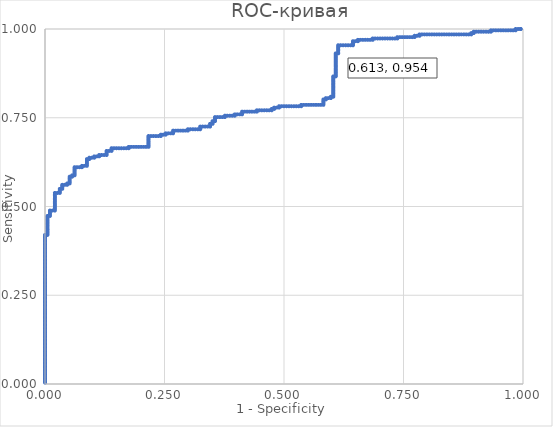
| Category | roc-кривая |
|---|---|
| 0.0 | 0.004 |
| 0.0 | 0.008 |
| 0.0 | 0.011 |
| 0.0 | 0.015 |
| 0.0 | 0.019 |
| 0.0 | 0.023 |
| 0.0 | 0.027 |
| 0.0 | 0.031 |
| 0.0 | 0.034 |
| 0.0 | 0.038 |
| 0.0 | 0.042 |
| 0.0 | 0.046 |
| 0.0 | 0.05 |
| 0.0 | 0.053 |
| 0.0 | 0.057 |
| 0.0 | 0.061 |
| 0.0 | 0.065 |
| 0.0 | 0.069 |
| 0.0 | 0.073 |
| 0.0 | 0.076 |
| 0.0 | 0.08 |
| 0.0 | 0.084 |
| 0.0 | 0.088 |
| 0.0 | 0.092 |
| 0.0 | 0.095 |
| 0.0 | 0.099 |
| 0.0 | 0.103 |
| 0.0 | 0.107 |
| 0.0 | 0.111 |
| 0.0 | 0.115 |
| 0.0 | 0.118 |
| 0.0 | 0.122 |
| 0.0 | 0.126 |
| 0.0 | 0.13 |
| 0.0 | 0.134 |
| 0.0 | 0.137 |
| 0.0 | 0.141 |
| 0.0 | 0.145 |
| 0.0 | 0.149 |
| 0.0 | 0.153 |
| 0.0 | 0.156 |
| 0.0 | 0.16 |
| 0.0 | 0.164 |
| 0.0 | 0.168 |
| 0.0 | 0.172 |
| 0.0 | 0.176 |
| 0.0 | 0.179 |
| 0.0 | 0.183 |
| 0.0 | 0.187 |
| 0.0 | 0.191 |
| 0.0 | 0.195 |
| 0.0 | 0.198 |
| 0.0 | 0.202 |
| 0.0 | 0.206 |
| 0.0 | 0.21 |
| 0.0 | 0.214 |
| 0.0 | 0.218 |
| 0.0 | 0.221 |
| 0.0 | 0.225 |
| 0.0 | 0.229 |
| 0.0 | 0.233 |
| 0.0 | 0.237 |
| 0.0 | 0.24 |
| 0.0 | 0.244 |
| 0.0 | 0.248 |
| 0.0 | 0.252 |
| 0.0 | 0.256 |
| 0.0 | 0.26 |
| 0.0 | 0.263 |
| 0.0 | 0.267 |
| 0.0 | 0.271 |
| 0.0 | 0.275 |
| 0.0 | 0.279 |
| 0.0 | 0.282 |
| 0.0 | 0.286 |
| 0.0 | 0.29 |
| 0.0 | 0.294 |
| 0.0 | 0.298 |
| 0.0 | 0.302 |
| 0.0 | 0.305 |
| 0.0 | 0.309 |
| 0.0 | 0.313 |
| 0.0 | 0.317 |
| 0.0 | 0.321 |
| 0.0 | 0.324 |
| 0.0 | 0.328 |
| 0.0 | 0.332 |
| 0.0 | 0.336 |
| 0.0 | 0.34 |
| 0.0 | 0.344 |
| 0.0 | 0.347 |
| 0.0 | 0.351 |
| 0.0 | 0.355 |
| 0.0 | 0.359 |
| 0.0 | 0.363 |
| 0.0 | 0.366 |
| 0.0 | 0.37 |
| 0.0 | 0.374 |
| 0.0 | 0.378 |
| 0.0 | 0.382 |
| 0.0 | 0.385 |
| 0.0 | 0.389 |
| 0.0 | 0.393 |
| 0.0 | 0.397 |
| 0.0 | 0.401 |
| 0.0 | 0.405 |
| 0.0 | 0.408 |
| 0.0 | 0.412 |
| 0.0 | 0.416 |
| 0.0 | 0.42 |
| 0.005154639175257714 | 0.42 |
| 0.005154639175257714 | 0.424 |
| 0.005154639175257714 | 0.427 |
| 0.005154639175257714 | 0.431 |
| 0.005154639175257714 | 0.435 |
| 0.005154639175257714 | 0.439 |
| 0.005154639175257714 | 0.443 |
| 0.005154639175257714 | 0.447 |
| 0.005154639175257714 | 0.45 |
| 0.005154639175257714 | 0.454 |
| 0.005154639175257714 | 0.458 |
| 0.005154639175257714 | 0.462 |
| 0.005154639175257714 | 0.466 |
| 0.005154639175257714 | 0.469 |
| 0.005154639175257714 | 0.473 |
| 0.010309278350515427 | 0.473 |
| 0.010309278350515427 | 0.477 |
| 0.010309278350515427 | 0.481 |
| 0.010309278350515427 | 0.485 |
| 0.010309278350515427 | 0.489 |
| 0.015463917525773141 | 0.489 |
| 0.020618556701030966 | 0.489 |
| 0.020618556701030966 | 0.492 |
| 0.020618556701030966 | 0.496 |
| 0.020618556701030966 | 0.5 |
| 0.020618556701030966 | 0.504 |
| 0.020618556701030966 | 0.508 |
| 0.020618556701030966 | 0.511 |
| 0.020618556701030966 | 0.515 |
| 0.020618556701030966 | 0.519 |
| 0.020618556701030966 | 0.523 |
| 0.020618556701030966 | 0.527 |
| 0.020618556701030966 | 0.531 |
| 0.020618556701030966 | 0.534 |
| 0.020618556701030966 | 0.538 |
| 0.02577319587628868 | 0.538 |
| 0.030927835051546393 | 0.538 |
| 0.030927835051546393 | 0.542 |
| 0.030927835051546393 | 0.546 |
| 0.030927835051546393 | 0.55 |
| 0.03608247422680411 | 0.55 |
| 0.03608247422680411 | 0.553 |
| 0.03608247422680411 | 0.557 |
| 0.03608247422680411 | 0.561 |
| 0.04123711340206182 | 0.561 |
| 0.046391752577319534 | 0.561 |
| 0.046391752577319534 | 0.565 |
| 0.05154639175257736 | 0.565 |
| 0.05154639175257736 | 0.569 |
| 0.05154639175257736 | 0.573 |
| 0.05154639175257736 | 0.576 |
| 0.05154639175257736 | 0.58 |
| 0.05154639175257736 | 0.584 |
| 0.05670103092783507 | 0.584 |
| 0.05670103092783507 | 0.588 |
| 0.061855670103092786 | 0.588 |
| 0.061855670103092786 | 0.592 |
| 0.061855670103092786 | 0.595 |
| 0.061855670103092786 | 0.599 |
| 0.061855670103092786 | 0.603 |
| 0.061855670103092786 | 0.607 |
| 0.061855670103092786 | 0.611 |
| 0.0670103092783505 | 0.611 |
| 0.07216494845360821 | 0.611 |
| 0.07731958762886593 | 0.611 |
| 0.07731958762886593 | 0.615 |
| 0.08247422680412375 | 0.615 |
| 0.08762886597938147 | 0.615 |
| 0.08762886597938147 | 0.618 |
| 0.08762886597938147 | 0.622 |
| 0.08762886597938147 | 0.626 |
| 0.08762886597938147 | 0.63 |
| 0.08762886597938147 | 0.634 |
| 0.09278350515463918 | 0.634 |
| 0.09278350515463918 | 0.637 |
| 0.09793814432989689 | 0.637 |
| 0.1030927835051546 | 0.637 |
| 0.1030927835051546 | 0.641 |
| 0.10824742268041232 | 0.641 |
| 0.11340206185567014 | 0.641 |
| 0.11340206185567014 | 0.645 |
| 0.11855670103092786 | 0.645 |
| 0.12371134020618557 | 0.645 |
| 0.12886597938144329 | 0.645 |
| 0.12886597938144329 | 0.649 |
| 0.12886597938144329 | 0.653 |
| 0.12886597938144329 | 0.656 |
| 0.134020618556701 | 0.656 |
| 0.1391752577319587 | 0.656 |
| 0.1391752577319587 | 0.66 |
| 0.1391752577319587 | 0.664 |
| 0.14432989690721654 | 0.664 |
| 0.14948453608247425 | 0.664 |
| 0.15463917525773196 | 0.664 |
| 0.15979381443298968 | 0.664 |
| 0.1649484536082474 | 0.664 |
| 0.1701030927835051 | 0.664 |
| 0.17525773195876293 | 0.664 |
| 0.17525773195876293 | 0.668 |
| 0.18041237113402064 | 0.668 |
| 0.18556701030927836 | 0.668 |
| 0.19072164948453607 | 0.668 |
| 0.19587628865979378 | 0.668 |
| 0.2010309278350515 | 0.668 |
| 0.20618556701030932 | 0.668 |
| 0.21134020618556704 | 0.668 |
| 0.21649484536082475 | 0.668 |
| 0.21649484536082475 | 0.672 |
| 0.21649484536082475 | 0.676 |
| 0.21649484536082475 | 0.679 |
| 0.21649484536082475 | 0.683 |
| 0.21649484536082475 | 0.687 |
| 0.21649484536082475 | 0.691 |
| 0.21649484536082475 | 0.695 |
| 0.21649484536082475 | 0.698 |
| 0.22164948453608246 | 0.698 |
| 0.22680412371134018 | 0.698 |
| 0.2319587628865979 | 0.698 |
| 0.23711340206185572 | 0.698 |
| 0.24226804123711343 | 0.698 |
| 0.24226804123711343 | 0.702 |
| 0.24742268041237114 | 0.702 |
| 0.25257731958762886 | 0.702 |
| 0.25257731958762886 | 0.706 |
| 0.25773195876288657 | 0.706 |
| 0.2628865979381443 | 0.706 |
| 0.2680412371134021 | 0.706 |
| 0.2680412371134021 | 0.71 |
| 0.2680412371134021 | 0.714 |
| 0.2731958762886598 | 0.714 |
| 0.27835051546391754 | 0.714 |
| 0.28350515463917525 | 0.714 |
| 0.28865979381443296 | 0.714 |
| 0.2938144329896907 | 0.714 |
| 0.2989690721649485 | 0.714 |
| 0.2989690721649485 | 0.718 |
| 0.3041237113402062 | 0.718 |
| 0.30927835051546393 | 0.718 |
| 0.31443298969072164 | 0.718 |
| 0.31958762886597936 | 0.718 |
| 0.32474226804123707 | 0.718 |
| 0.32474226804123707 | 0.721 |
| 0.32474226804123707 | 0.725 |
| 0.3298969072164949 | 0.725 |
| 0.3350515463917526 | 0.725 |
| 0.3402061855670103 | 0.725 |
| 0.34536082474226804 | 0.725 |
| 0.34536082474226804 | 0.729 |
| 0.34536082474226804 | 0.733 |
| 0.35051546391752575 | 0.733 |
| 0.35051546391752575 | 0.737 |
| 0.35051546391752575 | 0.74 |
| 0.35567010309278346 | 0.74 |
| 0.35567010309278346 | 0.744 |
| 0.35567010309278346 | 0.748 |
| 0.35567010309278346 | 0.752 |
| 0.3608247422680413 | 0.752 |
| 0.365979381443299 | 0.752 |
| 0.3711340206185567 | 0.752 |
| 0.37628865979381443 | 0.752 |
| 0.37628865979381443 | 0.756 |
| 0.38144329896907214 | 0.756 |
| 0.38659793814432986 | 0.756 |
| 0.3917525773195877 | 0.756 |
| 0.3969072164948454 | 0.756 |
| 0.3969072164948454 | 0.76 |
| 0.4020618556701031 | 0.76 |
| 0.4072164948453608 | 0.76 |
| 0.41237113402061853 | 0.76 |
| 0.41237113402061853 | 0.763 |
| 0.41237113402061853 | 0.767 |
| 0.41752577319587625 | 0.767 |
| 0.4226804123711341 | 0.767 |
| 0.4278350515463918 | 0.767 |
| 0.4329896907216495 | 0.767 |
| 0.4381443298969072 | 0.767 |
| 0.44329896907216493 | 0.767 |
| 0.44329896907216493 | 0.771 |
| 0.44845360824742264 | 0.771 |
| 0.45360824742268047 | 0.771 |
| 0.4587628865979382 | 0.771 |
| 0.4639175257731959 | 0.771 |
| 0.4690721649484536 | 0.771 |
| 0.4742268041237113 | 0.771 |
| 0.4742268041237113 | 0.775 |
| 0.47938144329896903 | 0.775 |
| 0.47938144329896903 | 0.779 |
| 0.48453608247422686 | 0.779 |
| 0.4896907216494846 | 0.779 |
| 0.4896907216494846 | 0.782 |
| 0.4948453608247423 | 0.782 |
| 0.5 | 0.782 |
| 0.5051546391752577 | 0.782 |
| 0.5103092783505154 | 0.782 |
| 0.5154639175257731 | 0.782 |
| 0.5206185567010309 | 0.782 |
| 0.5257731958762887 | 0.782 |
| 0.5309278350515464 | 0.782 |
| 0.5360824742268041 | 0.782 |
| 0.5360824742268041 | 0.786 |
| 0.5412371134020619 | 0.786 |
| 0.5463917525773196 | 0.786 |
| 0.5515463917525774 | 0.786 |
| 0.5567010309278351 | 0.786 |
| 0.5618556701030928 | 0.786 |
| 0.5670103092783505 | 0.786 |
| 0.5721649484536082 | 0.786 |
| 0.5773195876288659 | 0.786 |
| 0.5824742268041236 | 0.786 |
| 0.5824742268041236 | 0.79 |
| 0.5824742268041236 | 0.794 |
| 0.5824742268041236 | 0.798 |
| 0.5824742268041236 | 0.802 |
| 0.5876288659793815 | 0.802 |
| 0.5876288659793815 | 0.805 |
| 0.5927835051546392 | 0.805 |
| 0.5979381443298969 | 0.805 |
| 0.5979381443298969 | 0.809 |
| 0.6030927835051547 | 0.809 |
| 0.6030927835051547 | 0.813 |
| 0.6030927835051547 | 0.817 |
| 0.6030927835051547 | 0.821 |
| 0.6030927835051547 | 0.824 |
| 0.6030927835051547 | 0.828 |
| 0.6030927835051547 | 0.832 |
| 0.6030927835051547 | 0.836 |
| 0.6030927835051547 | 0.84 |
| 0.6030927835051547 | 0.844 |
| 0.6030927835051547 | 0.847 |
| 0.6030927835051547 | 0.851 |
| 0.6030927835051547 | 0.855 |
| 0.6030927835051547 | 0.859 |
| 0.6030927835051547 | 0.863 |
| 0.6030927835051547 | 0.866 |
| 0.6082474226804124 | 0.866 |
| 0.6082474226804124 | 0.87 |
| 0.6082474226804124 | 0.874 |
| 0.6082474226804124 | 0.878 |
| 0.6082474226804124 | 0.882 |
| 0.6082474226804124 | 0.885 |
| 0.6082474226804124 | 0.889 |
| 0.6082474226804124 | 0.893 |
| 0.6082474226804124 | 0.897 |
| 0.6082474226804124 | 0.901 |
| 0.6082474226804124 | 0.905 |
| 0.6082474226804124 | 0.908 |
| 0.6082474226804124 | 0.912 |
| 0.6082474226804124 | 0.916 |
| 0.6082474226804124 | 0.92 |
| 0.6082474226804124 | 0.924 |
| 0.6082474226804124 | 0.927 |
| 0.6082474226804124 | 0.931 |
| 0.6134020618556701 | 0.931 |
| 0.6134020618556701 | 0.935 |
| 0.6134020618556701 | 0.939 |
| 0.6134020618556701 | 0.943 |
| 0.6134020618556701 | 0.947 |
| 0.6134020618556701 | 0.95 |
| 0.6134020618556701 | 0.954 |
| 0.6185567010309279 | 0.954 |
| 0.6237113402061856 | 0.954 |
| 0.6288659793814433 | 0.954 |
| 0.634020618556701 | 0.954 |
| 0.6391752577319587 | 0.954 |
| 0.6443298969072164 | 0.954 |
| 0.6443298969072164 | 0.958 |
| 0.6443298969072164 | 0.962 |
| 0.6443298969072164 | 0.966 |
| 0.6494845360824743 | 0.966 |
| 0.654639175257732 | 0.966 |
| 0.654639175257732 | 0.969 |
| 0.6597938144329897 | 0.969 |
| 0.6649484536082475 | 0.969 |
| 0.6701030927835052 | 0.969 |
| 0.6752577319587629 | 0.969 |
| 0.6804123711340206 | 0.969 |
| 0.6855670103092784 | 0.969 |
| 0.6855670103092784 | 0.973 |
| 0.6907216494845361 | 0.973 |
| 0.6958762886597938 | 0.973 |
| 0.7010309278350515 | 0.973 |
| 0.7061855670103092 | 0.973 |
| 0.711340206185567 | 0.973 |
| 0.7164948453608248 | 0.973 |
| 0.7216494845360825 | 0.973 |
| 0.7268041237113403 | 0.973 |
| 0.731958762886598 | 0.973 |
| 0.7371134020618557 | 0.973 |
| 0.7371134020618557 | 0.977 |
| 0.7422680412371134 | 0.977 |
| 0.7474226804123711 | 0.977 |
| 0.7525773195876289 | 0.977 |
| 0.7577319587628866 | 0.977 |
| 0.7628865979381443 | 0.977 |
| 0.768041237113402 | 0.977 |
| 0.7731958762886598 | 0.977 |
| 0.7731958762886598 | 0.981 |
| 0.7783505154639175 | 0.981 |
| 0.7835051546391752 | 0.981 |
| 0.7835051546391752 | 0.985 |
| 0.788659793814433 | 0.985 |
| 0.7938144329896908 | 0.985 |
| 0.7989690721649485 | 0.985 |
| 0.8041237113402062 | 0.985 |
| 0.8092783505154639 | 0.985 |
| 0.8144329896907216 | 0.985 |
| 0.8195876288659794 | 0.985 |
| 0.8247422680412371 | 0.985 |
| 0.8298969072164948 | 0.985 |
| 0.8350515463917526 | 0.985 |
| 0.8402061855670103 | 0.985 |
| 0.845360824742268 | 0.985 |
| 0.8505154639175257 | 0.985 |
| 0.8556701030927836 | 0.985 |
| 0.8608247422680413 | 0.985 |
| 0.865979381443299 | 0.985 |
| 0.8711340206185567 | 0.985 |
| 0.8762886597938144 | 0.985 |
| 0.8814432989690721 | 0.985 |
| 0.8865979381443299 | 0.985 |
| 0.8917525773195876 | 0.985 |
| 0.8917525773195876 | 0.989 |
| 0.8969072164948454 | 0.989 |
| 0.8969072164948454 | 0.992 |
| 0.9020618556701031 | 0.992 |
| 0.9072164948453608 | 0.992 |
| 0.9123711340206185 | 0.992 |
| 0.9175257731958762 | 0.992 |
| 0.9226804123711341 | 0.992 |
| 0.9278350515463918 | 0.992 |
| 0.9329896907216495 | 0.992 |
| 0.9329896907216495 | 0.996 |
| 0.9381443298969072 | 0.996 |
| 0.9432989690721649 | 0.996 |
| 0.9484536082474226 | 0.996 |
| 0.9536082474226804 | 0.996 |
| 0.9587628865979382 | 0.996 |
| 0.9639175257731959 | 0.996 |
| 0.9690721649484536 | 0.996 |
| 0.9742268041237113 | 0.996 |
| 0.979381443298969 | 0.996 |
| 0.9845360824742269 | 0.996 |
| 0.9845360824742269 | 1 |
| 0.9896907216494846 | 1 |
| 0.9948453608247423 | 1 |
| 0.9948717948717949 | 1 |